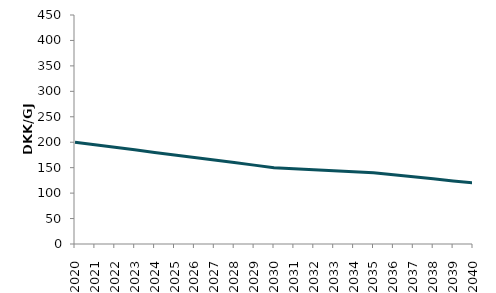
| Category | Brintpris |
|---|---|
| 2020.0 | 200 |
| 2021.0 | 195 |
| 2022.0 | 190 |
| 2023.0 | 185 |
| 2024.0 | 180 |
| 2025.0 | 175 |
| 2026.0 | 170 |
| 2027.0 | 165 |
| 2028.0 | 160 |
| 2029.0 | 155 |
| 2030.0 | 150 |
| 2031.0 | 148 |
| 2032.0 | 146 |
| 2033.0 | 144 |
| 2034.0 | 142 |
| 2035.0 | 140 |
| 2036.0 | 136 |
| 2037.0 | 132 |
| 2038.0 | 128 |
| 2039.0 | 124 |
| 2040.0 | 120 |